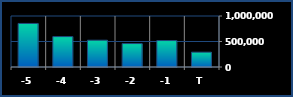
| Category | Series 0 |
|---|---|
| T | 290718 |
| -1 | 518358 |
| -2 | 459073 |
| -3 | 525290 |
| -4 | 595882 |
| -5 | 853819 |